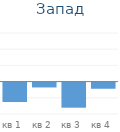
| Category | Запад |
|---|---|
| кв 1 | -1200 |
| кв 2 | -300 |
| кв 3 | -1550 |
| кв 4 | -380 |